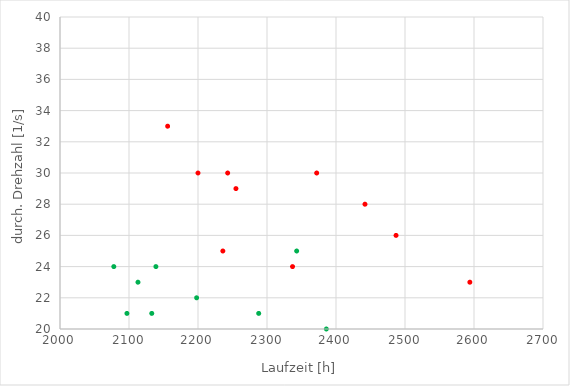
| Category | Series 0 |
|---|---|
| 2372.0 | 30 |
| 2386.0 | 20 |
| 2133.0 | 21 |
| 2200.0 | 30 |
| 2198.0 | 22 |
| 2296.0 | 18 |
| 2594.0 | 23 |
| 2255.0 | 29 |
| 2156.0 | 33 |
| 2113.0 | 23 |
| 2288.0 | 21 |
| 2139.0 | 24 |
| 2442.0 | 28 |
| 2243.0 | 30 |
| 2337.0 | 24 |
| 2097.0 | 21 |
| 2078.0 | 24 |
| 2487.0 | 26 |
| 2236.0 | 25 |
| 2343.0 | 25 |